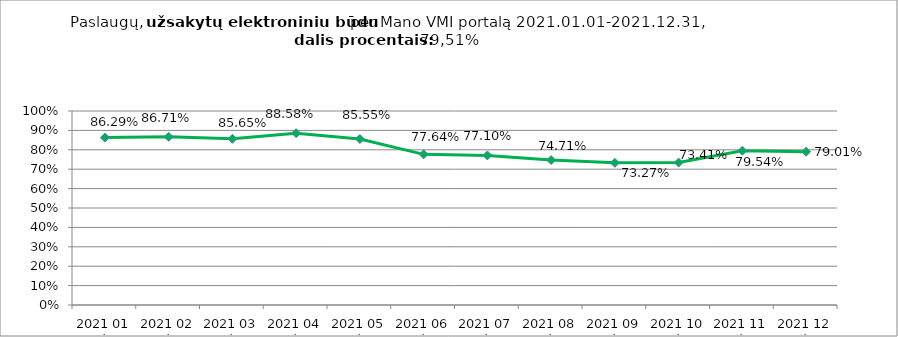
| Category | Elektroniniu būdu užsakytų paslaugų dalis procentais (lyginant su visomis Mano VMI portale užsakytomis paslaugomis) |
|---|---|
| 2021 01 mėn. | 0.863 |
| 2021 02 mėn. | 0.867 |
| 2021 03 mėn. | 0.856 |
| 2021 04 mėn. | 0.886 |
| 2021 05 mėn. | 0.855 |
| 2021 06 mėn. | 0.776 |
| 2021 07 mėn. | 0.771 |
| 2021 08 mėn. | 0.747 |
| 2021 09 mėn. | 0.733 |
| 2021 10 mėn. | 0.734 |
| 2021 11 mėn. | 0.795 |
| 2021 12 mėn. | 0.79 |